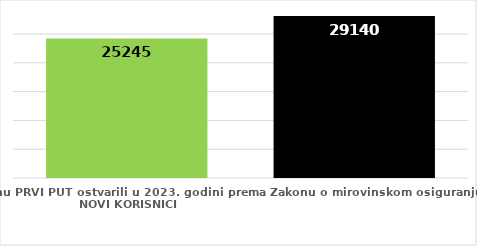
| Category | broj korisnika |
|---|---|
| Korisnici koji su pravo na mirovinu PRVI PUT ostvarili u 2023. godini prema Zakonu o mirovinskom osiguranju - NOVI KORISNICI | 25245 |
| Korisnici mirovina kojima je u 2023. godini PRESTALO PRAVO NA MIROVINU - uzrok smrt 
koji su pravo na mirovinu ostvarili prema Zakonu o mirovinskom osiguranju | 29140 |